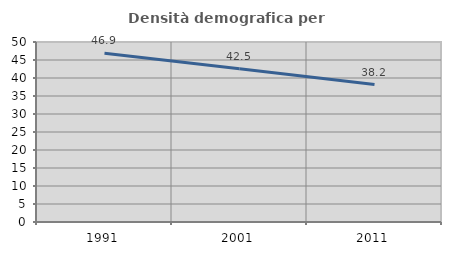
| Category | Densità demografica |
|---|---|
| 1991.0 | 46.851 |
| 2001.0 | 42.548 |
| 2011.0 | 38.171 |